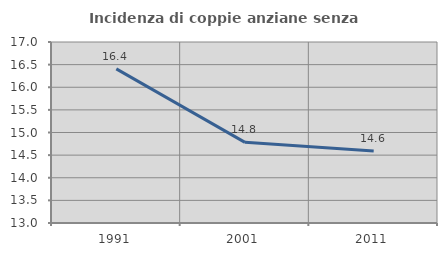
| Category | Incidenza di coppie anziane senza figli  |
|---|---|
| 1991.0 | 16.406 |
| 2001.0 | 14.783 |
| 2011.0 | 14.592 |